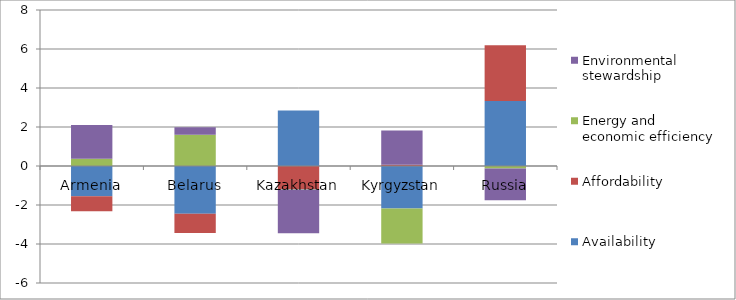
| Category | Availability | Affordability | Energy and economic efficiency | Environmental stewardship |
|---|---|---|---|---|
| Armenia | -1.554 | -0.76 | 0.371 | 1.73 |
| Belarus | -2.453 | -0.984 | 1.597 | 0.386 |
| Kazakhstan | 2.849 | -1.18 | -0.03 | -2.239 |
| Kyrgyzstan | -2.18 | 0.067 | -1.8 | 1.75 |
| Russia | 3.338 | 2.85 | -0.134 | -1.627 |